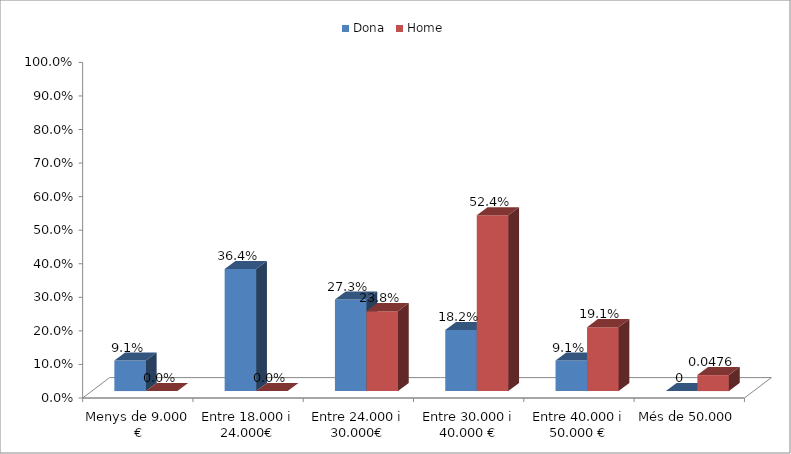
| Category | Dona | Home |
|---|---|---|
| Menys de 9.000 € | 0.091 | 0 |
| Entre 18.000 i 24.000€ | 0.364 | 0 |
| Entre 24.000 i 30.000€ | 0.273 | 0.238 |
| Entre 30.000 i 40.000 € | 0.182 | 0.524 |
| Entre 40.000 i 50.000 € | 0.091 | 0.19 |
| Més de 50.000 | 0 | 0.048 |